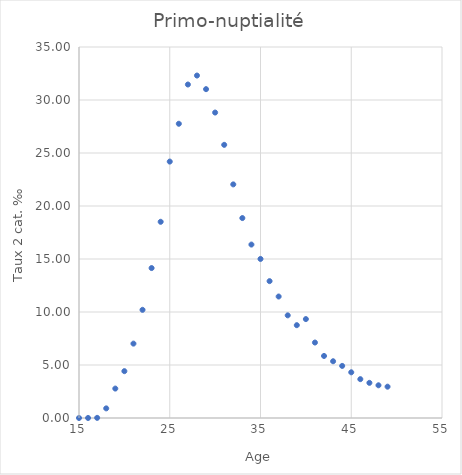
| Category | Primo-nuptialité |
|---|---|
| 15.0 | 0.003 |
| 16.0 | 0.003 |
| 17.0 | 0.013 |
| 18.0 | 0.908 |
| 19.0 | 2.776 |
| 20.0 | 4.419 |
| 21.0 | 7.017 |
| 22.0 | 10.205 |
| 23.0 | 14.145 |
| 24.0 | 18.51 |
| 25.0 | 24.191 |
| 26.0 | 27.758 |
| 27.0 | 31.461 |
| 28.0 | 32.307 |
| 29.0 | 31.024 |
| 30.0 | 28.816 |
| 31.0 | 25.771 |
| 32.0 | 22.039 |
| 33.0 | 18.862 |
| 34.0 | 16.361 |
| 35.0 | 15.006 |
| 36.0 | 12.912 |
| 37.0 | 11.46 |
| 38.0 | 9.684 |
| 39.0 | 8.756 |
| 40.0 | 9.332 |
| 41.0 | 7.119 |
| 42.0 | 5.853 |
| 43.0 | 5.353 |
| 44.0 | 4.914 |
| 45.0 | 4.312 |
| 46.0 | 3.665 |
| 47.0 | 3.317 |
| 48.0 | 3.086 |
| 49.0 | 2.954 |